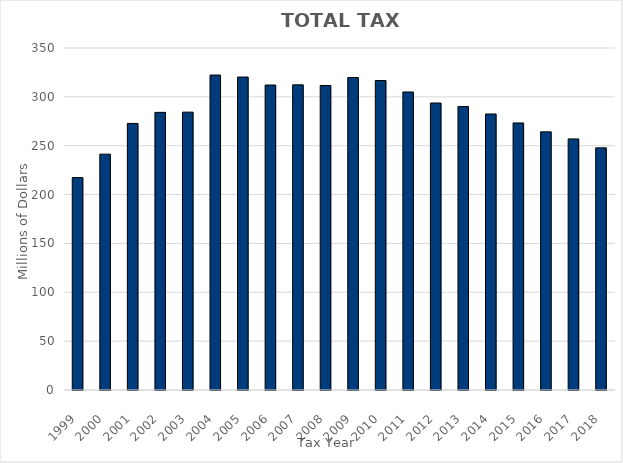
| Category | TAX FORGIVENESS |
|---|---|
| 1999.0 | 217.402 |
| 2000.0 | 241.351 |
| 2001.0 | 272.817 |
| 2002.0 | 284.121 |
| 2003.0 | 284.355 |
| 2004.0 | 322.314 |
| 2005.0 | 320.284 |
| 2006.0 | 312.091 |
| 2007.0 | 312.289 |
| 2008.0 | 311.612 |
| 2009.0 | 319.78 |
| 2010.0 | 316.705 |
| 2011.0 | 304.977 |
| 2012.0 | 293.712 |
| 2013.0 | 290.042 |
| 2014.0 | 282.446 |
| 2015.0 | 273.303 |
| 2016.0 | 264.185 |
| 2017.0 | 256.967 |
| 2018.0 | 247.793 |